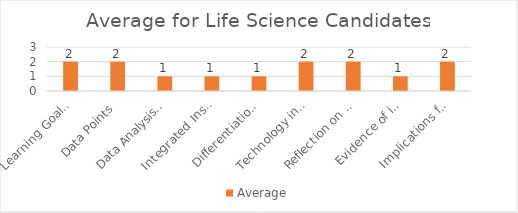
| Category | Average |
|---|---|
| Learning Goals Aligned with Pre-/Post-assessments ACEI 4.0 | 2 |
| Data Points | 2 |
| Data Analysis for Pedagogical Decisions ACEI 4.0 | 1 |
| Integrated Instruction ACEI 3.1 | 1 |
| Differentiation based on knowledge of individual learning ACEI 3.2 | 1 |
| Technology integration | 2 |
| Reflection on pedagogical decisions ACEI 1.0 | 2 |
| Evidence of impact on student learning ACEI 5.1 | 1 |
| Implications for teaching and professional development ACEI 5.1 | 2 |